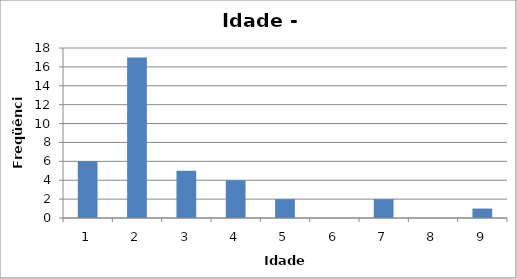
| Category | Series 0 |
|---|---|
| 0 | 6 |
| 1 | 17 |
| 2 | 5 |
| 3 | 4 |
| 4 | 2 |
| 5 | 0 |
| 6 | 2 |
| 7 | 0 |
| 8 | 1 |